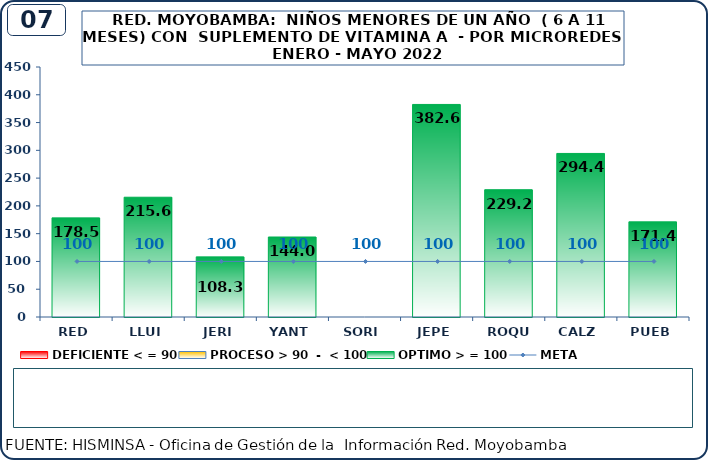
| Category | DEFICIENTE < = 90 | PROCESO > 90  -  < 100 | OPTIMO > = 100 |
|---|---|---|---|
| RED | 0 | 0 | 178.5 |
| LLUI | 0 | 0 | 215.6 |
| JERI | 0 | 0 | 108.3 |
| YANT | 0 | 0 | 144 |
| SORI | 0 | 0 | 0 |
| JEPE | 0 | 0 | 382.6 |
| ROQU | 0 | 0 | 229.2 |
| CALZ | 0 | 0 | 294.4 |
| PUEB | 0 | 0 | 171.4 |